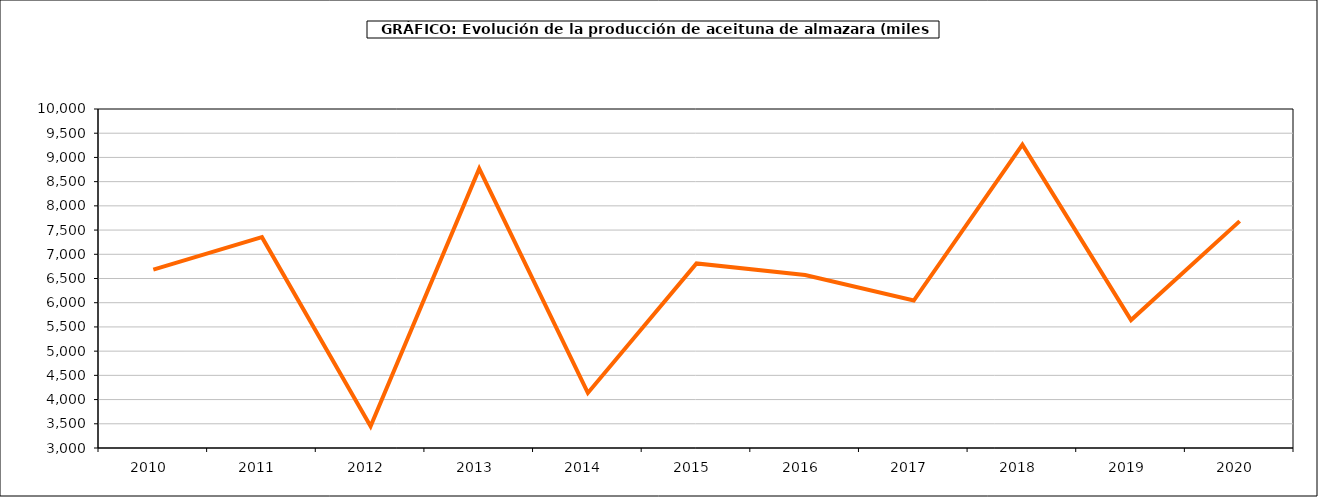
| Category | producción |
|---|---|
| 2010.0 | 6682.009 |
| 2011.0 | 7352.697 |
| 2012.0 | 3448.612 |
| 2013.0 | 8766.897 |
| 2014.0 | 4136.73 |
| 2015.0 | 6811.611 |
| 2016.0 | 6571.428 |
| 2017.0 | 6044.453 |
| 2018.0 | 9264.536 |
| 2019.0 | 5642.056 |
| 2020.0 | 7684.413 |